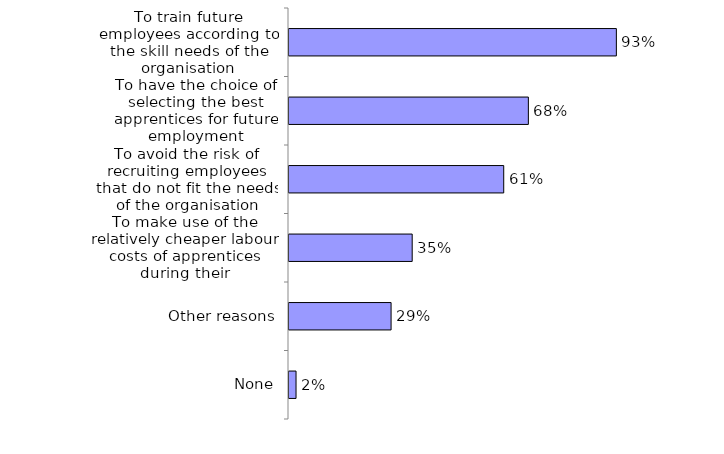
| Category | Series 0 |
|---|---|
| To train future employees according to the skill needs of the organisation | 0.93 |
| To have the choice of selecting the best apprentices for future employment | 0.68 |
| To avoid the risk of recruiting employees that do not fit the needs of the organisation | 0.61 |
| To make use of the relatively cheaper labour costs of apprentices during their apprenticeship | 0.35 |
| Other reasons | 0.29 |
| None | 0.02 |